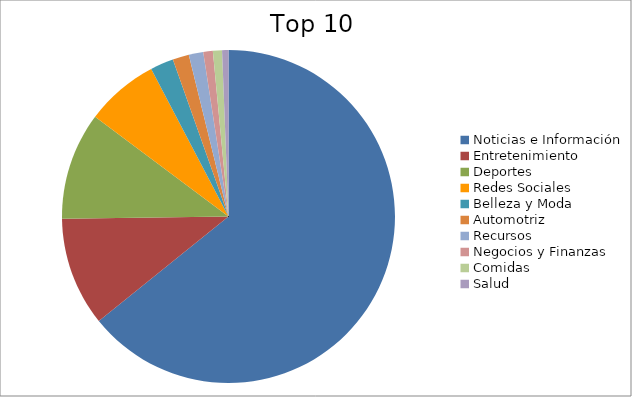
| Category | Series 0 |
|---|---|
| Noticias e Información | 62.43 |
| Entretenimiento | 10.28 |
| Deportes | 10.14 |
| Redes Sociales | 6.91 |
| Belleza y Moda | 2.2 |
| Automotriz | 1.54 |
| Recursos | 1.37 |
| Negocios y Finanzas | 0.9 |
| Comidas | 0.86 |
| Salud | 0.6 |